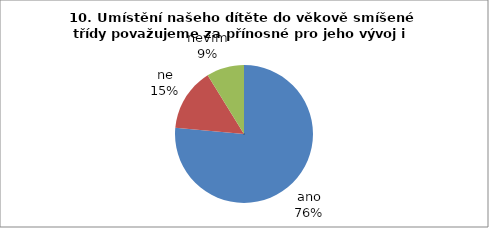
| Category | 10. |
|---|---|
| ano | 26 |
| ne | 5 |
| nevím | 3 |